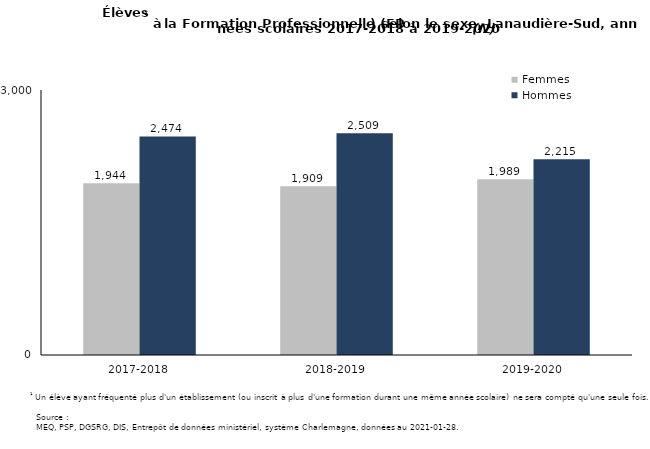
| Category | Femmes | Hommes |
|---|---|---|
| 2017-2018 | 1944 | 2474 |
| 2018-2019 | 1909 | 2509 |
| 2019-2020 | 1989 | 2215 |